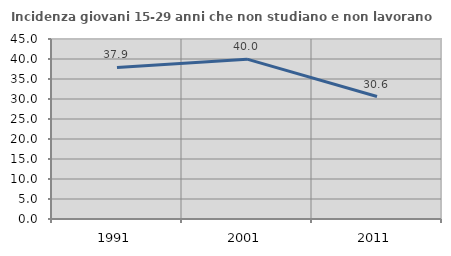
| Category | Incidenza giovani 15-29 anni che non studiano e non lavorano  |
|---|---|
| 1991.0 | 37.895 |
| 2001.0 | 39.963 |
| 2011.0 | 30.617 |